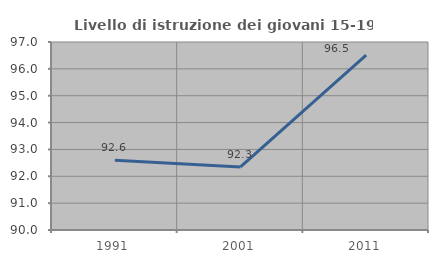
| Category | Livello di istruzione dei giovani 15-19 anni |
|---|---|
| 1991.0 | 92.593 |
| 2001.0 | 92.35 |
| 2011.0 | 96.512 |